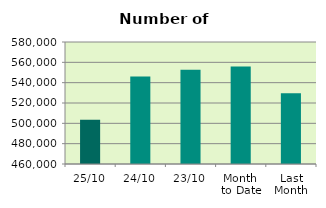
| Category | Series 0 |
|---|---|
| 25/10 | 503464 |
| 24/10 | 546078 |
| 23/10 | 552718 |
| Month 
to Date | 555822.211 |
| Last
Month | 529677.905 |